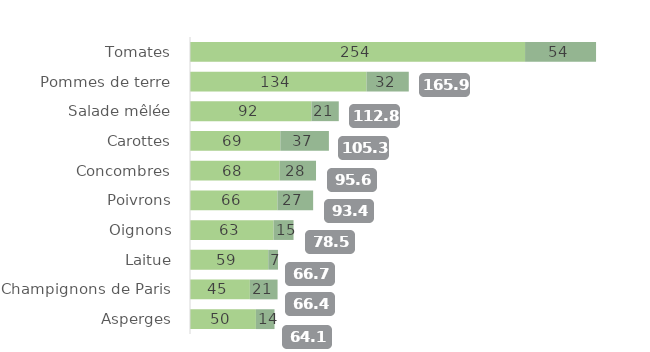
| Category | Non bio | Bio |
|---|---|---|
| Tomates | 254.079 | 53.825 |
| Pommes de terre | 133.807 | 32.092 |
| Salade mêlée | 92.085 | 20.733 |
| Carottes | 68.507 | 36.816 |
| Concombres | 67.995 | 27.566 |
| Poivrons | 66.296 | 27.081 |
| Oignons | 63.372 | 15.134 |
| Laitue | 59.333 | 7.371 |
| Champignons de Paris | 45.402 | 20.999 |
| Asperges | 49.981 | 14.111 |